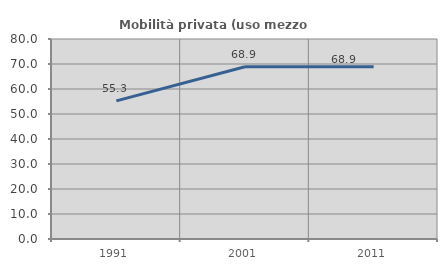
| Category | Mobilità privata (uso mezzo privato) |
|---|---|
| 1991.0 | 55.255 |
| 2001.0 | 68.878 |
| 2011.0 | 68.917 |